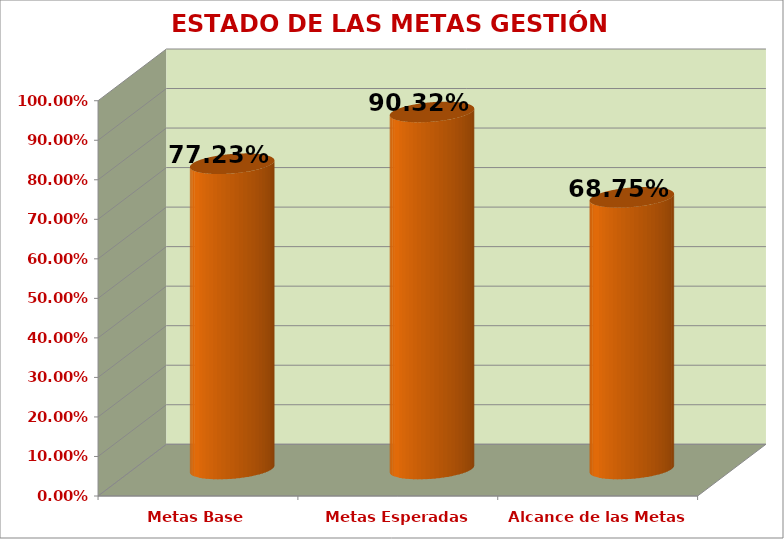
| Category | ESTADO DE METAS GESTIÓN DIRECTIVA |
|---|---|
| Metas Base | 0.772 |
| Metas Esperadas | 0.903 |
| Alcance de las Metas | 0.688 |